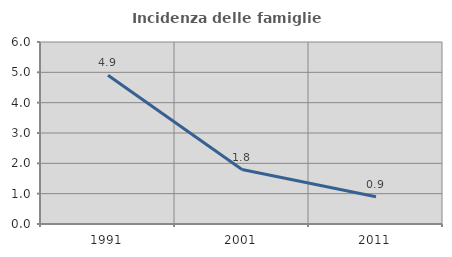
| Category | Incidenza delle famiglie numerose |
|---|---|
| 1991.0 | 4.905 |
| 2001.0 | 1.794 |
| 2011.0 | 0.896 |